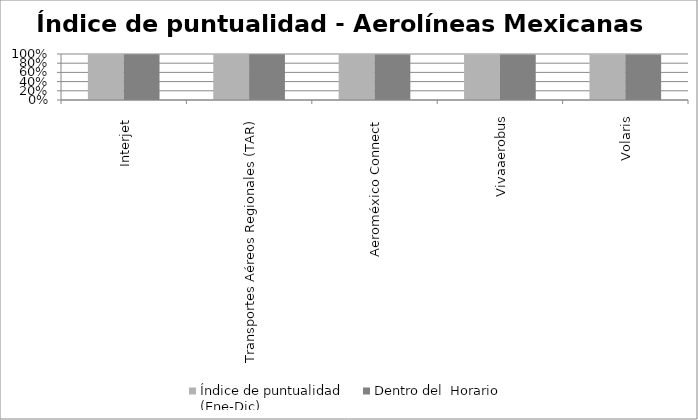
| Category | Índice de puntualidad
(Ene-Dic) | Dentro del  Horario |
|---|---|---|
| Interjet  | 0.997 | 0.996 |
| Transportes Aéreos Regionales (TAR) | 0.994 | 0.994 |
| Aeroméxico Connect  | 0.994 | 0.991 |
| Vivaaerobus | 0.988 | 0.988 |
| Volaris | 0.99 | 0.987 |